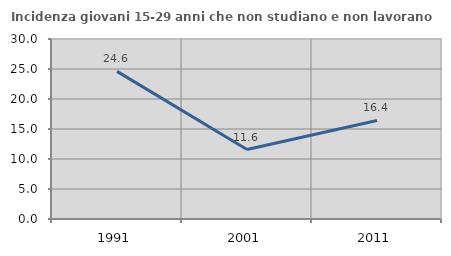
| Category | Incidenza giovani 15-29 anni che non studiano e non lavorano  |
|---|---|
| 1991.0 | 24.606 |
| 2001.0 | 11.58 |
| 2011.0 | 16.426 |